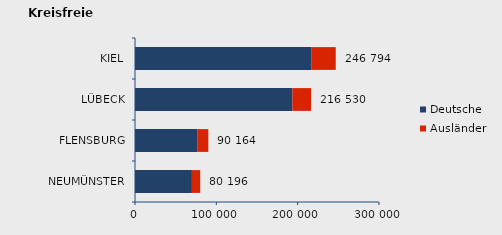
| Category | Deutsche | Ausländer | Series 2 |
|---|---|---|---|
| NEUMÜNSTER | 69976 | 10220 | 80196 |
| FLENSBURG | 76453 | 13711 | 90164 |
| LÜBECK | 193542 | 22988 | 216530 |
| KIEL | 217208 | 29586 | 246794 |